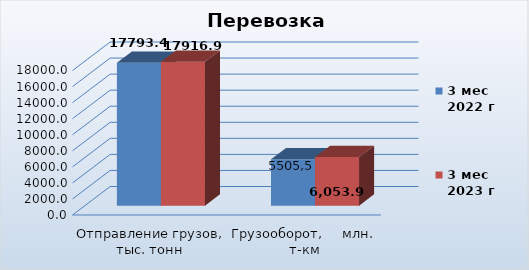
| Category | 3 мес
2022 г | 3 мес
2023 г |
|---|---|---|
| Отправление грузов, тыс. тонн | 17793.4 | 17916.9 |
| Грузооборот,     млн. т-км | 5778.4 | 6053.9 |